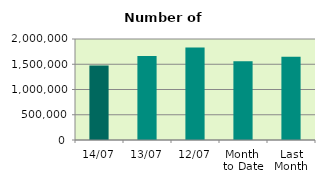
| Category | Series 0 |
|---|---|
| 14/07 | 1477244 |
| 13/07 | 1664846 |
| 12/07 | 1830864 |
| Month 
to Date | 1561828.2 |
| Last
Month | 1646651.818 |